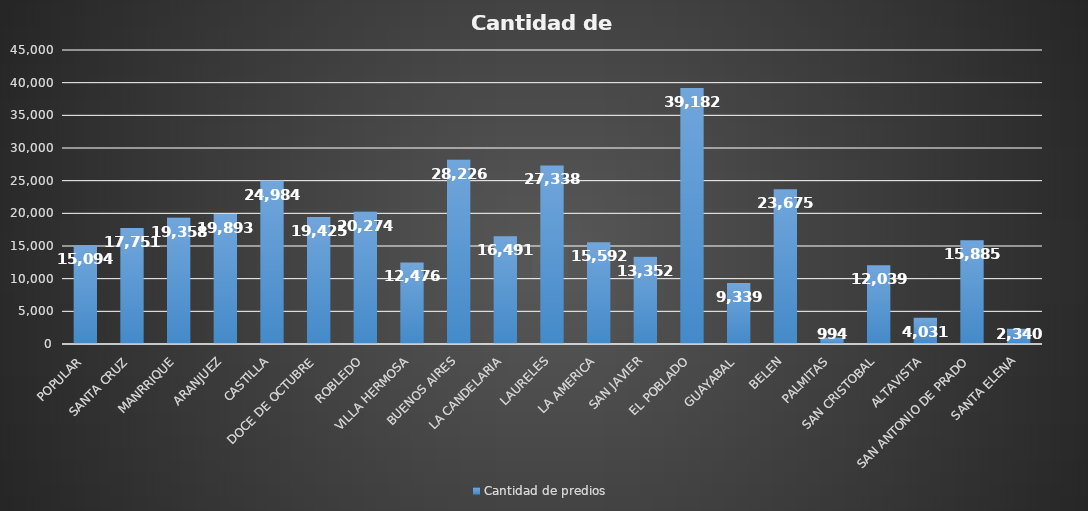
| Category | Cantidad de predios  |
|---|---|
| POPULAR | 15094 |
| SANTA CRUZ | 17751 |
| MANRRIQUE | 19358 |
| ARANJUEZ | 19893 |
| CASTILLA | 24984 |
| DOCE DE OCTUBRE | 19425 |
| ROBLEDO | 20274 |
| VILLA HERMOSA | 12476 |
| BUENOS AIRES | 28226 |
| LA CANDELARIA | 16491 |
| LAURELES | 27338 |
| LA AMERICA | 15592 |
| SAN JAVIER | 13352 |
| EL POBLADO | 39182 |
| GUAYABAL | 9339 |
| BELEN | 23675 |
| PALMITAS | 994 |
| SAN CRISTOBAL | 12039 |
| ALTAVISTA | 4031 |
| SAN ANTONIO DE PRADO | 15885 |
| SANTA ELENA | 2340 |